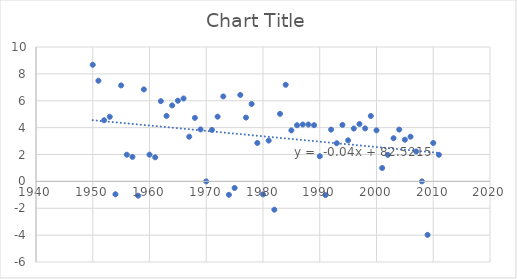
| Category | Series 0 |
|---|---|
| 1950.0 | 8.677 |
| 1951.0 | 7.489 |
| 1952.0 | 4.548 |
| 1953.0 | 4.805 |
| 1954.0 | -0.959 |
| 1955.0 | 7.142 |
| 1956.0 | 1.984 |
| 1957.0 | 1.824 |
| 1958.0 | -1.065 |
| 1959.0 | 6.843 |
| 1960.0 | 1.989 |
| 1961.0 | 1.789 |
| 1962.0 | 5.971 |
| 1963.0 | 4.872 |
| 1964.0 | 5.653 |
| 1965.0 | 6.002 |
| 1966.0 | 6.168 |
| 1967.0 | 3.324 |
| 1968.0 | 4.725 |
| 1969.0 | 3.865 |
| 1970.0 | 0 |
| 1971.0 | 3.83 |
| 1972.0 | 4.816 |
| 1973.0 | 6.323 |
| 1974.0 | -1.001 |
| 1975.0 | -0.49 |
| 1976.0 | 6.432 |
| 1977.0 | 4.748 |
| 1978.0 | 5.762 |
| 1979.0 | 2.857 |
| 1980.0 | -0.968 |
| 1981.0 | 3.035 |
| 1982.0 | -2.108 |
| 1983.0 | 5.026 |
| 1984.0 | 7.187 |
| 1985.0 | 3.795 |
| 1986.0 | 4.177 |
| 1987.0 | 4.232 |
| 1988.0 | 4.231 |
| 1989.0 | 4.183 |
| 1990.0 | 1.87 |
| 1991.0 | -1.019 |
| 1992.0 | 3.852 |
| 1993.0 | 2.84 |
| 1994.0 | 4.203 |
| 1995.0 | 3.053 |
| 1996.0 | 3.933 |
| 1997.0 | 4.267 |
| 1998.0 | 3.942 |
| 1999.0 | 4.866 |
| 2000.0 | 3.797 |
| 2001.0 | 0.996 |
| 2002.0 | 1.973 |
| 2003.0 | 3.209 |
| 2004.0 | 3.854 |
| 2005.0 | 3.1 |
| 2006.0 | 3.324 |
| 2007.0 | 2.224 |
| 2008.0 | 0 |
| 2009.0 | -3.982 |
| 2010.0 | 2.858 |
| 2011.0 | 1.979 |